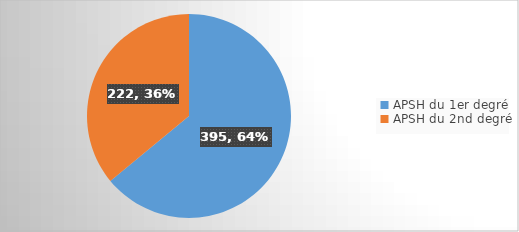
| Category | Series 0 |
|---|---|
| APSH du 1er degré | 395 |
| APSH du 2nd degré | 222 |